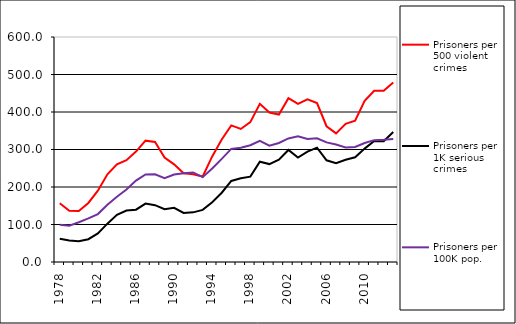
| Category | Prisoners per 500 violent crimes | Prisoners per 1K serious crimes | Prisoners per 100K pop. |
|---|---|---|---|
| 1978.0 | 156.539 | 62.065 | 99.617 |
| 1979.0 | 136.7 | 57.422 | 96.665 |
| 1980.0 | 136.017 | 55.43 | 105.912 |
| 1981.0 | 157.458 | 60.794 | 116.338 |
| 1982.0 | 190.282 | 76.056 | 127.824 |
| 1983.0 | 233.931 | 102.244 | 152.784 |
| 1984.0 | 260.464 | 125.845 | 174.077 |
| 1985.0 | 271.455 | 137.335 | 193.143 |
| 1986.0 | 294.458 | 139.538 | 217.188 |
| 1987.0 | 323.612 | 155.784 | 233.481 |
| 1988.0 | 320.214 | 151.469 | 233.896 |
| 1989.0 | 278.765 | 140.597 | 223.478 |
| 1990.0 | 260.299 | 144.397 | 233.091 |
| 1991.0 | 236.783 | 130.986 | 236.593 |
| 1992.0 | 233.861 | 132.405 | 238.922 |
| 1993.0 | 227.913 | 138.941 | 226.274 |
| 1994.0 | 281.554 | 159.478 | 249.452 |
| 1995.0 | 326.816 | 184.679 | 275.01 |
| 1996.0 | 364.405 | 216.159 | 301.555 |
| 1997.0 | 354.722 | 223.203 | 304.855 |
| 1998.0 | 372.904 | 227.584 | 311.259 |
| 1999.0 | 421.646 | 267.443 | 322.789 |
| 2000.0 | 398.472 | 261.125 | 310.368 |
| 2001.0 | 393.116 | 272.953 | 317.417 |
| 2002.0 | 436.748 | 298.749 | 329.49 |
| 2003.0 | 421.568 | 278.381 | 335.146 |
| 2004.0 | 433.979 | 294.199 | 327.981 |
| 2005.0 | 423.699 | 305.022 | 329.965 |
| 2006.0 | 362.024 | 271.237 | 318.949 |
| 2007.0 | 342.956 | 263.603 | 313.257 |
| 2008.0 | 368.505 | 272.559 | 305.25 |
| 2009.0 | 377.007 | 279.346 | 306.555 |
| 2010.0 | 429.731 | 302.355 | 317.232 |
| 2011.0 | 456.803 | 322.499 | 324.939 |
| 2012.0 | 456.568 | 322.225 | 325.709 |
| 2013.0 | 478.747 | 346.884 | 328.268 |